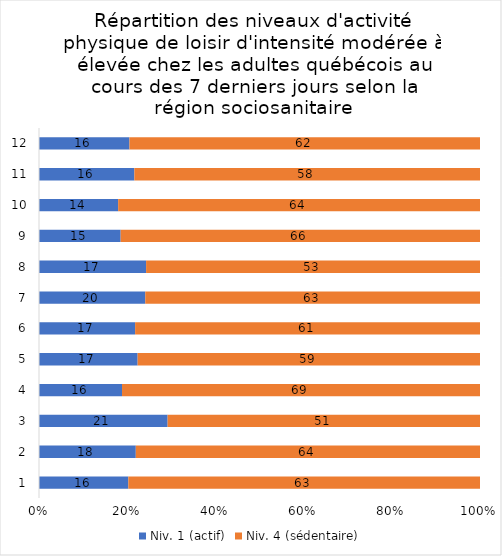
| Category | Niv. 1 (actif) | Niv. 4 (sédentaire) |
|---|---|---|
| 0 | 16 | 63 |
| 1 | 18 | 64 |
| 2 | 21 | 51 |
| 3 | 16 | 69 |
| 4 | 17 | 59 |
| 5 | 17 | 61 |
| 6 | 20 | 63 |
| 7 | 17 | 53 |
| 8 | 15 | 66 |
| 9 | 14 | 64 |
| 10 | 16 | 58 |
| 11 | 16 | 62 |